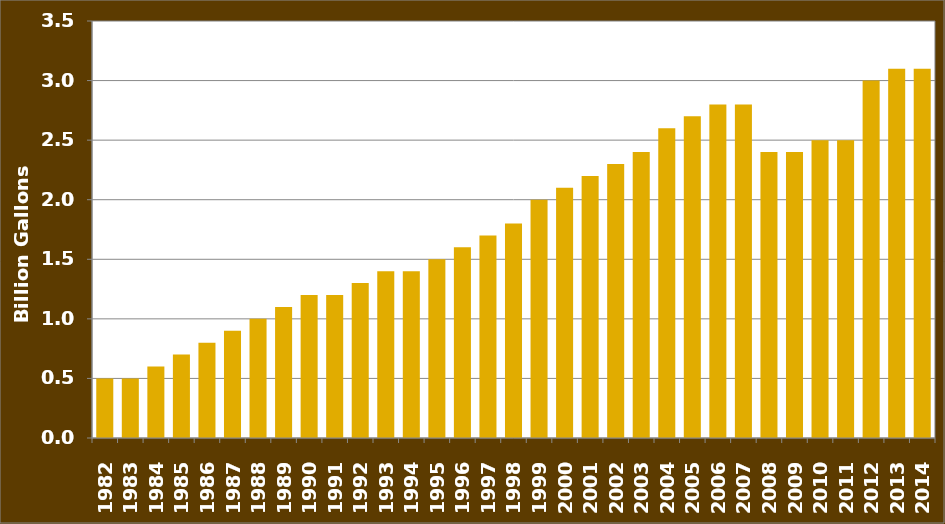
| Category | Series 0 |
|---|---|
| 1982.0 | 0.5 |
| 1983.0 | 0.5 |
| 1984.0 | 0.6 |
| 1985.0 | 0.7 |
| 1986.0 | 0.8 |
| 1987.0 | 0.9 |
| 1988.0 | 1 |
| 1989.0 | 1.1 |
| 1990.0 | 1.2 |
| 1991.0 | 1.2 |
| 1992.0 | 1.3 |
| 1993.0 | 1.4 |
| 1994.0 | 1.4 |
| 1995.0 | 1.5 |
| 1996.0 | 1.6 |
| 1997.0 | 1.7 |
| 1998.0 | 1.8 |
| 1999.0 | 2 |
| 2000.0 | 2.1 |
| 2001.0 | 2.2 |
| 2002.0 | 2.3 |
| 2003.0 | 2.4 |
| 2004.0 | 2.6 |
| 2005.0 | 2.7 |
| 2006.0 | 2.8 |
| 2007.0 | 2.8 |
| 2008.0 | 2.4 |
| 2009.0 | 2.4 |
| 2010.0 | 2.5 |
| 2011.0 | 2.5 |
| 2012.0 | 3 |
| 2013.0 | 3.1 |
| 2014.0 | 3.1 |